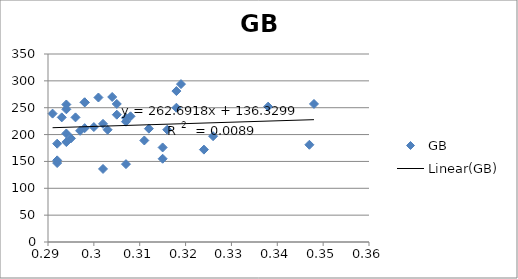
| Category | GB |
|---|---|
| 0.348 | 257 |
| 0.347 | 181 |
| 0.338 | 252 |
| 0.326 | 197 |
| 0.324 | 172 |
| 0.319 | 294 |
| 0.318 | 250 |
| 0.318 | 281 |
| 0.316 | 209 |
| 0.315 | 176 |
| 0.315 | 155 |
| 0.312 | 211 |
| 0.311 | 189 |
| 0.308 | 234 |
| 0.307 | 231 |
| 0.307 | 224 |
| 0.307 | 145 |
| 0.305 | 237 |
| 0.305 | 257 |
| 0.304 | 270 |
| 0.303 | 209 |
| 0.302 | 220 |
| 0.302 | 136 |
| 0.301 | 269 |
| 0.3 | 214 |
| 0.298 | 212 |
| 0.298 | 260 |
| 0.298 | 260 |
| 0.297 | 207 |
| 0.296 | 232 |
| 0.295 | 193 |
| 0.294 | 186 |
| 0.294 | 247 |
| 0.294 | 256 |
| 0.294 | 202 |
| 0.293 | 232 |
| 0.292 | 147 |
| 0.292 | 152 |
| 0.292 | 183 |
| 0.291 | 239 |